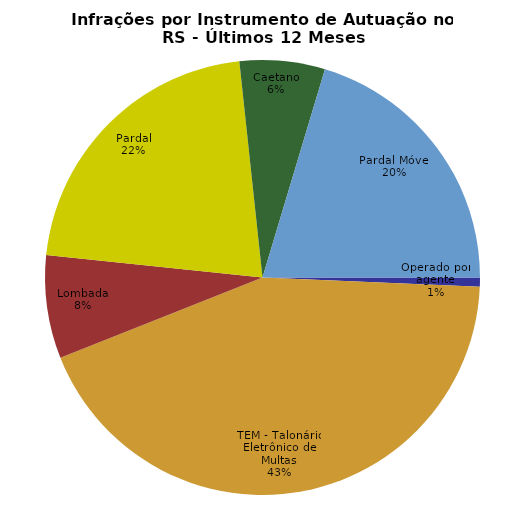
| Category | Últimos 12 Meses |
|---|---|
| Operado por agente | 17350 |
| TEM - Talonário Eletrônico de Multas | 1099527 |
| Lombada | 194773 |
| Pardal | 549942 |
| Caetano | 160910 |
| Pardal Móvel | 517159 |